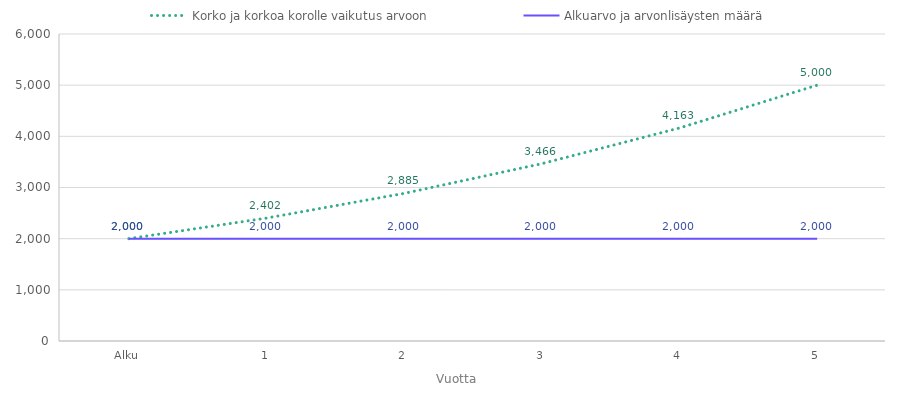
| Category | Korko ja korkoa korolle vaikutus arvoon | Alkuarvo ja arvonlisäysten määrä |
|---|---|---|
| Alku | 2000 | 2000 |
| 1 | 2402.248 | 2000 |
| 2 | 2885.398 | 2000 |
| 3 | 3465.72 | 2000 |
| 4 | 4162.76 | 2000 |
| 5 | 4999.991 | 2000 |